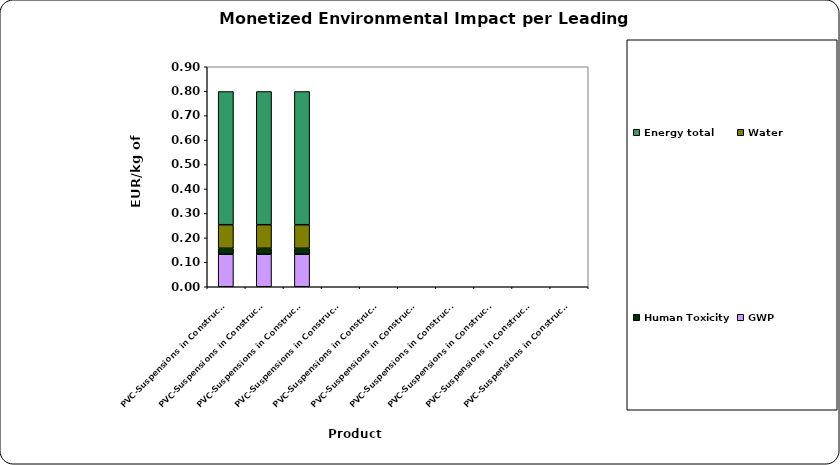
| Category | GWP | Human Toxicity | Water | Energy total |
|---|---|---|---|---|
| PVC-Suspensions in Construction in Window profile | 0.133 | 0.024 | 0.096 | 0.545 |
| PVC-Suspensions in Construction in Fresh water conveying pipe | 0.133 | 0.024 | 0.096 | 0.545 |
| PVC-Suspensions in Construction in Sewage pipe | 0.133 | 0.024 | 0.096 | 0.545 |
| PVC-Suspensions in Construction in application 4 | 0 | 0 | 0 | 0 |
| PVC-Suspensions in Construction in application 5 | 0 | 0 | 0 | 0 |
| PVC-Suspensions in Construction in application 6 | 0 | 0 | 0 | 0 |
| PVC-Suspensions in Construction in application 7 | 0 | 0 | 0 | 0 |
| PVC-Suspensions in Construction in application 8 | 0 | 0 | 0 | 0 |
| PVC-Suspensions in Construction in application 9 | 0 | 0 | 0 | 0 |
| PVC-Suspensions in Construction in application 10 | 0 | 0 | 0 | 0 |